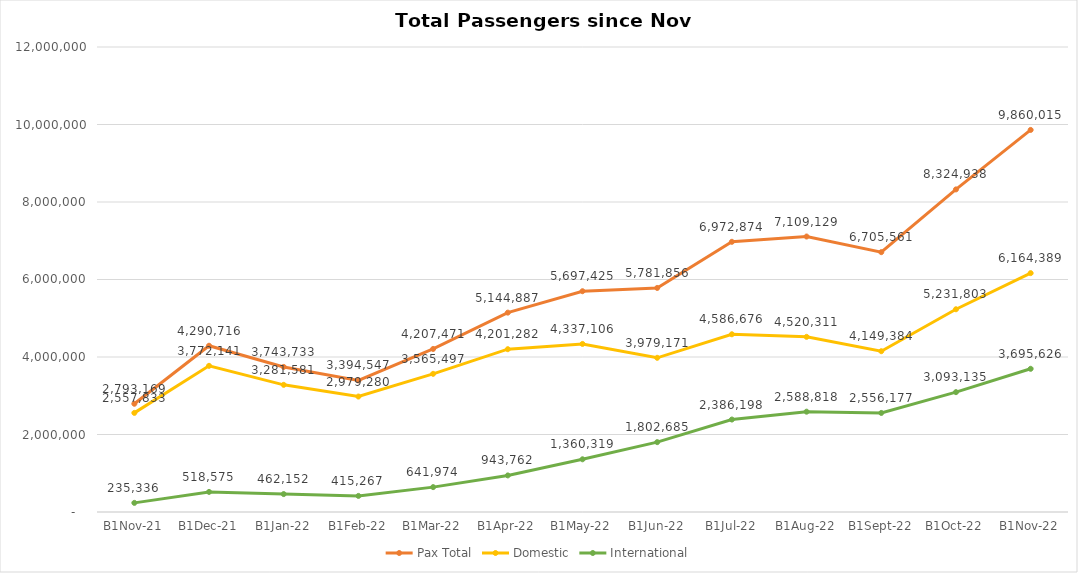
| Category | Pax Total |  Domestic  |  International  |
|---|---|---|---|
| 2021-11-01 | 2793169 | 2557833 | 235336 |
| 2021-12-01 | 4290716 | 3772141 | 518575 |
| 2022-01-01 | 3743733 | 3281581 | 462152 |
| 2022-02-01 | 3394547 | 2979280 | 415267 |
| 2022-03-01 | 4207471 | 3565497 | 641974 |
| 2022-04-01 | 5144887 | 4201282 | 943762 |
| 2022-05-01 | 5697425 | 4337106 | 1360319 |
| 2022-06-01 | 5781856 | 3979171 | 1802685 |
| 2022-07-01 | 6972874 | 4586676 | 2386198 |
| 2022-08-01 | 7109129 | 4520311 | 2588818 |
| 2022-09-01 | 6705561 | 4149384 | 2556177 |
| 2022-10-01 | 8324938 | 5231803 | 3093135 |
| 2022-11-01 | 9860015 | 6164389 | 3695626 |